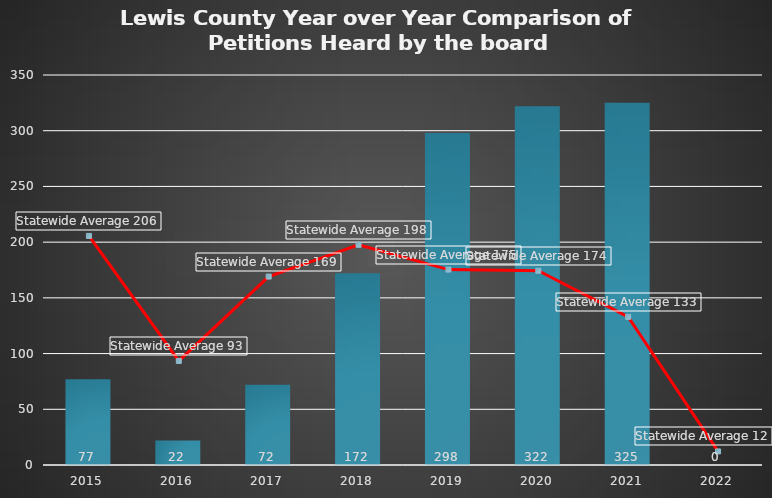
| Category | Heard by the board |
|---|---|
| 2015.0 | 77 |
| 2016.0 | 22 |
| 2017.0 | 72 |
| 2018.0 | 172 |
| 2019.0 | 298 |
| 2020.0 | 322 |
| 2021.0 | 325 |
| 2022.0 | 0 |